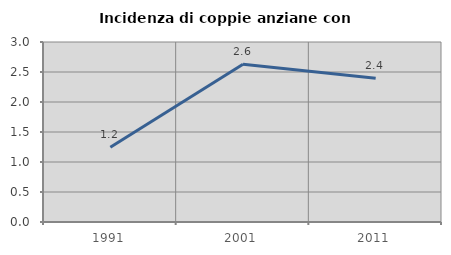
| Category | Incidenza di coppie anziane con figli |
|---|---|
| 1991.0 | 1.245 |
| 2001.0 | 2.628 |
| 2011.0 | 2.394 |